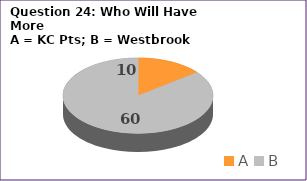
| Category | Series 0 |
|---|---|
| A | 10 |
| B | 60 |